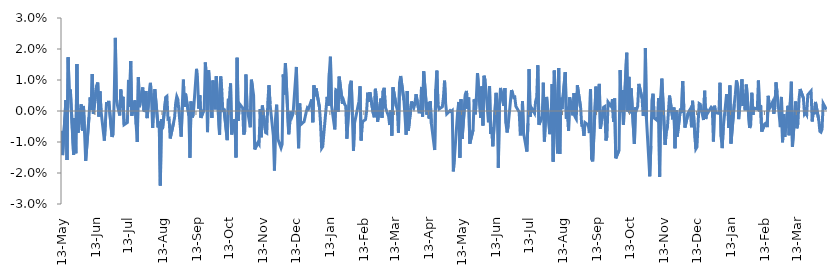
| Category | Series 0 |
|---|---|
| 2010-05-13 | -0.006 |
| 2010-05-14 | -0.014 |
| 2010-05-17 | 0.004 |
| 2010-05-18 | -0.016 |
| 2010-05-19 | 0.017 |
| 2010-05-20 | 0.006 |
| 2010-05-21 | 0.007 |
| 2010-05-24 | -0.014 |
| 2010-05-25 | -0.002 |
| 2010-05-26 | -0.014 |
| 2010-05-27 | 0.015 |
| 2010-05-28 | -0.007 |
| 2010-05-31 | 0.002 |
| 2010-06-01 | -0.006 |
| 2010-06-02 | 0.002 |
| 2010-06-03 | -0.007 |
| 2010-06-04 | -0.016 |
| 2010-06-07 | -0.002 |
| 2010-06-08 | 0.004 |
| 2010-06-09 | 0 |
| 2010-06-10 | 0.012 |
| 2010-06-11 | -0.001 |
| 2010-06-14 | 0.008 |
| 2010-06-15 | 0.009 |
| 2010-06-16 | -0.002 |
| 2010-06-17 | 0.006 |
| 2010-06-18 | 0 |
| 2010-06-21 | -0.01 |
| 2010-06-22 | -0.003 |
| 2010-06-23 | 0.003 |
| 2010-06-24 | 0.002 |
| 2010-06-25 | 0.003 |
| 2010-06-28 | -0.008 |
| 2010-06-29 | -0.007 |
| 2010-06-30 | 0.004 |
| 2010-07-01 | 0.024 |
| 2010-07-02 | 0.003 |
| 2010-07-05 | -0.001 |
| 2010-07-06 | 0.007 |
| 2010-07-07 | 0.001 |
| 2010-07-08 | 0.005 |
| 2010-07-09 | -0.004 |
| 2010-07-12 | -0.004 |
| 2010-07-13 | 0.01 |
| 2010-07-14 | 0.001 |
| 2010-07-15 | 0.016 |
| 2010-07-16 | -0.002 |
| 2010-07-19 | 0.003 |
| 2010-07-20 | -0.004 |
| 2010-07-21 | -0.01 |
| 2010-07-22 | 0.011 |
| 2010-07-23 | 0.001 |
| 2010-07-26 | 0.008 |
| 2010-07-27 | 0 |
| 2010-07-28 | 0 |
| 2010-07-29 | 0.006 |
| 2010-07-30 | -0.002 |
| 2010-08-02 | 0.009 |
| 2010-08-03 | 0.004 |
| 2010-08-04 | -0.005 |
| 2010-08-05 | 0.002 |
| 2010-08-06 | 0.007 |
| 2010-08-09 | -0.005 |
| 2010-08-10 | -0.003 |
| 2010-08-11 | -0.024 |
| 2010-08-12 | -0.003 |
| 2010-08-13 | -0.006 |
| 2010-08-16 | 0.004 |
| 2010-08-17 | 0.005 |
| 2010-08-18 | -0.003 |
| 2010-08-19 | -0.002 |
| 2010-08-20 | -0.009 |
| 2010-08-23 | -0.004 |
| 2010-08-24 | -0.002 |
| 2010-08-25 | 0.003 |
| 2010-08-26 | 0.005 |
| 2010-08-27 | 0.004 |
| 2010-08-30 | -0.008 |
| 2010-08-31 | 0.001 |
| 2010-09-01 | 0.01 |
| 2010-09-02 | 0.001 |
| 2010-09-03 | 0.006 |
| 2010-09-06 | -0.001 |
| 2010-09-07 | -0.015 |
| 2010-09-08 | 0.003 |
| 2010-09-09 | -0.002 |
| 2010-09-10 | -0.001 |
| 2010-09-13 | 0.014 |
| 2010-09-14 | 0.009 |
| 2010-09-15 | 0.001 |
| 2010-09-16 | 0.005 |
| 2010-09-17 | -0.002 |
| 2010-09-20 | 0.001 |
| 2010-09-21 | 0.016 |
| 2010-09-22 | 0.011 |
| 2010-09-23 | -0.007 |
| 2010-09-24 | 0.013 |
| 2010-09-27 | -0.002 |
| 2010-09-28 | 0.01 |
| 2010-09-29 | 0.003 |
| 2010-09-30 | 0.001 |
| 2010-10-01 | 0.011 |
| 2010-10-04 | -0.008 |
| 2010-10-05 | 0.011 |
| 2010-10-06 | 0.007 |
| 2010-10-07 | 0 |
| 2010-10-08 | 0.001 |
| 2010-10-11 | -0.009 |
| 2010-10-12 | 0.004 |
| 2010-10-13 | 0.002 |
| 2010-10-14 | 0.009 |
| 2010-10-15 | -0.008 |
| 2010-10-18 | -0.003 |
| 2010-10-19 | -0.015 |
| 2010-10-20 | 0.017 |
| 2010-10-21 | -0.003 |
| 2010-10-22 | 0.002 |
| 2010-10-25 | 0.001 |
| 2010-10-26 | -0.008 |
| 2010-10-27 | -0.006 |
| 2010-10-28 | 0.012 |
| 2010-10-29 | 0.001 |
| 2010-11-01 | -0.005 |
| 2010-11-02 | 0.01 |
| 2010-11-03 | 0.008 |
| 2010-11-04 | 0.005 |
| 2010-11-05 | -0.012 |
| 2010-11-08 | -0.01 |
| 2010-11-09 | -0.011 |
| 2010-11-10 | 0.001 |
| 2010-11-11 | -0.008 |
| 2010-11-12 | 0.002 |
| 2010-11-15 | -0.007 |
| 2010-11-16 | -0.007 |
| 2010-11-17 | 0.003 |
| 2010-11-18 | 0.008 |
| 2010-11-19 | 0.002 |
| 2010-11-22 | -0.008 |
| 2010-11-23 | -0.019 |
| 2010-11-24 | -0.002 |
| 2010-11-25 | 0.002 |
| 2010-11-26 | -0.009 |
| 2010-11-29 | -0.012 |
| 2010-11-30 | -0.011 |
| 2010-12-01 | 0.012 |
| 2010-12-02 | 0.005 |
| 2010-12-03 | 0.015 |
| 2010-12-06 | -0.007 |
| 2010-12-07 | -0.004 |
| 2010-12-08 | 0 |
| 2010-12-09 | -0.002 |
| 2010-12-10 | -0.001 |
| 2010-12-13 | 0.014 |
| 2010-12-14 | -0.002 |
| 2010-12-15 | -0.012 |
| 2010-12-16 | 0.002 |
| 2010-12-17 | -0.004 |
| 2010-12-20 | -0.003 |
| 2010-12-21 | -0.002 |
| 2010-12-22 | 0 |
| 2010-12-23 | 0.001 |
| 2010-12-24 | 0.001 |
| 2010-12-27 | 0.004 |
| 2010-12-28 | -0.004 |
| 2010-12-29 | 0.008 |
| 2010-12-30 | 0.005 |
| 2010-12-31 | 0.007 |
| 2011-01-03 | 0.001 |
| 2011-01-04 | -0.004 |
| 2011-01-05 | -0.012 |
| 2011-01-06 | -0.011 |
| 2011-01-07 | -0.007 |
| 2011-01-10 | 0.005 |
| 2011-01-11 | 0.002 |
| 2011-01-12 | 0.012 |
| 2011-01-13 | 0.018 |
| 2011-01-14 | 0.002 |
| 2011-01-17 | -0.006 |
| 2011-01-18 | 0.007 |
| 2011-01-19 | 0.007 |
| 2011-01-20 | 0 |
| 2011-01-21 | 0.011 |
| 2011-01-24 | 0.002 |
| 2011-01-25 | 0.003 |
| 2011-01-26 | 0.002 |
| 2011-01-27 | 0.002 |
| 2011-01-28 | -0.009 |
| 2011-01-31 | 0.009 |
| 2011-02-01 | 0.01 |
| 2011-02-02 | -0.001 |
| 2011-02-03 | -0.013 |
| 2011-02-04 | -0.004 |
| 2011-02-07 | 0.001 |
| 2011-02-08 | 0.003 |
| 2011-02-09 | 0.008 |
| 2011-02-10 | -0.01 |
| 2011-02-11 | -0.004 |
| 2011-02-14 | -0.003 |
| 2011-02-15 | 0 |
| 2011-02-16 | 0.006 |
| 2011-02-17 | 0.003 |
| 2011-02-18 | 0.006 |
| 2011-02-21 | -0.001 |
| 2011-02-22 | -0.002 |
| 2011-02-23 | 0.007 |
| 2011-02-24 | 0.004 |
| 2011-02-25 | -0.003 |
| 2011-02-28 | 0.004 |
| 2011-03-01 | -0.002 |
| 2011-03-02 | 0.006 |
| 2011-03-03 | 0.007 |
| 2011-03-04 | 0.001 |
| 2011-03-07 | -0.002 |
| 2011-03-08 | -0.005 |
| 2011-03-09 | 0 |
| 2011-03-10 | -0.008 |
| 2011-03-11 | 0.008 |
| 2011-03-14 | 0.002 |
| 2011-03-15 | 0 |
| 2011-03-16 | -0.007 |
| 2011-03-17 | 0.009 |
| 2011-03-18 | 0.011 |
| 2011-03-21 | 0.003 |
| 2011-03-22 | -0.002 |
| 2011-03-23 | -0.008 |
| 2011-03-24 | 0.006 |
| 2011-03-25 | -0.006 |
| 2011-03-28 | 0.003 |
| 2011-03-29 | 0.002 |
| 2011-03-30 | 0.001 |
| 2011-03-31 | 0.002 |
| 2011-04-01 | 0.005 |
| 2011-04-04 | -0.001 |
| 2011-04-05 | 0 |
| 2011-04-06 | 0.008 |
| 2011-04-07 | -0.002 |
| 2011-04-08 | 0.013 |
| 2011-04-11 | -0.001 |
| 2011-04-12 | 0.003 |
| 2011-04-13 | -0.002 |
| 2011-04-14 | 0.003 |
| 2011-04-15 | -0.004 |
| 2011-04-18 | -0.013 |
| 2011-04-19 | 0.007 |
| 2011-04-20 | 0.013 |
| 2011-04-21 | 0.002 |
| 2011-04-22 | 0.001 |
| 2011-04-25 | 0.001 |
| 2011-04-26 | 0.004 |
| 2011-04-27 | 0.01 |
| 2011-04-28 | 0.002 |
| 2011-04-29 | -0.001 |
| 2011-05-02 | 0 |
| 2011-05-03 | 0 |
| 2011-05-04 | 0 |
| 2011-05-05 | -0.019 |
| 2011-05-06 | -0.015 |
| 2011-05-09 | 0 |
| 2011-05-10 | 0.003 |
| 2011-05-11 | -0.015 |
| 2011-05-12 | 0.004 |
| 2011-05-13 | -0.009 |
| 2011-05-16 | 0.005 |
| 2011-05-17 | 0.006 |
| 2011-05-18 | 0.001 |
| 2011-05-19 | 0.004 |
| 2011-05-20 | -0.011 |
| 2011-05-23 | -0.006 |
| 2011-05-24 | 0.004 |
| 2011-05-25 | -0.001 |
| 2011-05-26 | 0.004 |
| 2011-05-27 | 0.012 |
| 2011-05-30 | -0.002 |
| 2011-05-31 | 0.008 |
| 2011-06-01 | -0.005 |
| 2011-06-02 | 0.011 |
| 2011-06-03 | 0.01 |
| 2011-06-06 | -0.004 |
| 2011-06-07 | 0.008 |
| 2011-06-08 | -0.007 |
| 2011-06-09 | -0.005 |
| 2011-06-10 | -0.011 |
| 2011-06-13 | 0.006 |
| 2011-06-14 | 0.002 |
| 2011-06-15 | -0.018 |
| 2011-06-16 | 0.002 |
| 2011-06-17 | 0.007 |
| 2011-06-20 | 0.002 |
| 2011-06-21 | 0.007 |
| 2011-06-22 | -0.004 |
| 2011-06-23 | -0.007 |
| 2011-06-24 | -0.005 |
| 2011-06-27 | 0.007 |
| 2011-06-28 | 0.006 |
| 2011-06-29 | 0.004 |
| 2011-06-30 | 0.004 |
| 2011-07-01 | 0.002 |
| 2011-07-04 | 0 |
| 2011-07-05 | -0.008 |
| 2011-07-06 | -0.008 |
| 2011-07-07 | 0.003 |
| 2011-07-08 | -0.007 |
| 2011-07-11 | -0.013 |
| 2011-07-12 | -0.004 |
| 2011-07-13 | 0.014 |
| 2011-07-14 | -0.002 |
| 2011-07-15 | 0.001 |
| 2011-07-18 | -0.001 |
| 2011-07-19 | 0.003 |
| 2011-07-20 | 0.004 |
| 2011-07-21 | 0.015 |
| 2011-07-22 | -0.004 |
| 2011-07-25 | -0.002 |
| 2011-07-26 | 0.009 |
| 2011-07-27 | -0.01 |
| 2011-07-28 | -0.002 |
| 2011-07-29 | 0.005 |
| 2011-08-01 | -0.007 |
| 2011-08-02 | -0.003 |
| 2011-08-03 | 0.009 |
| 2011-08-04 | -0.016 |
| 2011-08-05 | 0.013 |
| 2011-08-08 | -0.014 |
| 2011-08-09 | 0.014 |
| 2011-08-10 | -0.014 |
| 2011-08-11 | 0.004 |
| 2011-08-12 | 0.001 |
| 2011-08-15 | 0.013 |
| 2011-08-16 | -0.002 |
| 2011-08-17 | 0.001 |
| 2011-08-18 | -0.006 |
| 2011-08-19 | 0.004 |
| 2011-08-22 | -0.001 |
| 2011-08-23 | 0.006 |
| 2011-08-24 | -0.002 |
| 2011-08-25 | -0.003 |
| 2011-08-26 | 0.008 |
| 2011-08-29 | 0.001 |
| 2011-08-30 | -0.005 |
| 2011-08-31 | -0.005 |
| 2011-09-01 | -0.008 |
| 2011-09-02 | -0.004 |
| 2011-09-05 | -0.005 |
| 2011-09-06 | -0.007 |
| 2011-09-07 | 0.007 |
| 2011-09-08 | -0.016 |
| 2011-09-09 | -0.016 |
| 2011-09-12 | 0.008 |
| 2011-09-13 | 0 |
| 2011-09-14 | 0.006 |
| 2011-09-15 | 0.009 |
| 2011-09-16 | -0.006 |
| 2011-09-19 | 0.001 |
| 2011-09-20 | 0.001 |
| 2011-09-21 | -0.01 |
| 2011-09-22 | -0.008 |
| 2011-09-23 | 0.003 |
| 2011-09-26 | 0.001 |
| 2011-09-27 | 0.004 |
| 2011-09-28 | -0.003 |
| 2011-09-29 | 0.004 |
| 2011-09-30 | -0.015 |
| 2011-10-03 | -0.013 |
| 2011-10-04 | 0.013 |
| 2011-10-05 | 0 |
| 2011-10-06 | 0.007 |
| 2011-10-07 | -0.004 |
| 2011-10-10 | 0.019 |
| 2011-10-11 | 0 |
| 2011-10-12 | 0.011 |
| 2011-10-13 | -0.001 |
| 2011-10-14 | 0.007 |
| 2011-10-17 | -0.011 |
| 2011-10-18 | 0.001 |
| 2011-10-19 | 0 |
| 2011-10-20 | 0.002 |
| 2011-10-21 | 0.009 |
| 2011-10-24 | 0.004 |
| 2011-10-25 | -0.002 |
| 2011-10-26 | 0 |
| 2011-10-27 | 0.02 |
| 2011-10-28 | -0.003 |
| 2011-10-31 | -0.021 |
| 2011-11-01 | -0.011 |
| 2011-11-02 | 0.003 |
| 2011-11-03 | 0.006 |
| 2011-11-04 | -0.002 |
| 2011-11-07 | -0.003 |
| 2011-11-08 | 0.004 |
| 2011-11-09 | -0.021 |
| 2011-11-10 | 0.005 |
| 2011-11-11 | 0.01 |
| 2011-11-14 | -0.011 |
| 2011-11-15 | -0.007 |
| 2011-11-16 | -0.006 |
| 2011-11-17 | 0 |
| 2011-11-18 | 0.005 |
| 2011-11-21 | -0.003 |
| 2011-11-22 | 0.001 |
| 2011-11-23 | -0.012 |
| 2011-11-24 | 0 |
| 2011-11-25 | -0.008 |
| 2011-11-28 | 0.001 |
| 2011-11-29 | -0.001 |
| 2011-11-30 | 0.01 |
| 2011-12-01 | 0.001 |
| 2011-12-02 | -0.005 |
| 2011-12-05 | -0.001 |
| 2011-12-06 | 0 |
| 2011-12-07 | 0.001 |
| 2011-12-08 | -0.005 |
| 2011-12-09 | 0.003 |
| 2011-12-12 | -0.012 |
| 2011-12-13 | -0.012 |
| 2011-12-14 | -0.004 |
| 2011-12-15 | 0.002 |
| 2011-12-16 | 0.002 |
| 2011-12-19 | -0.003 |
| 2011-12-20 | 0.007 |
| 2011-12-21 | -0.003 |
| 2011-12-22 | 0 |
| 2011-12-23 | -0.001 |
| 2011-12-26 | 0.001 |
| 2011-12-27 | 0.001 |
| 2011-12-28 | -0.01 |
| 2011-12-29 | 0.002 |
| 2011-12-30 | -0.001 |
| 2012-01-02 | -0.001 |
| 2012-01-03 | 0.009 |
| 2012-01-04 | -0.008 |
| 2012-01-05 | -0.012 |
| 2012-01-06 | -0.005 |
| 2012-01-09 | 0.005 |
| 2012-01-10 | 0.001 |
| 2012-01-11 | -0.005 |
| 2012-01-12 | 0.008 |
| 2012-01-13 | -0.011 |
| 2012-01-16 | 0.002 |
| 2012-01-17 | 0.005 |
| 2012-01-18 | 0.01 |
| 2012-01-19 | 0.008 |
| 2012-01-20 | -0.003 |
| 2012-01-23 | 0.01 |
| 2012-01-24 | 0.002 |
| 2012-01-25 | 0.006 |
| 2012-01-26 | 0 |
| 2012-01-27 | 0.009 |
| 2012-01-30 | -0.005 |
| 2012-01-31 | -0.004 |
| 2012-02-01 | 0.006 |
| 2012-02-02 | -0.001 |
| 2012-02-03 | 0.001 |
| 2012-02-06 | 0.001 |
| 2012-02-07 | 0.01 |
| 2012-02-08 | 0 |
| 2012-02-09 | 0.002 |
| 2012-02-10 | -0.007 |
| 2012-02-13 | -0.004 |
| 2012-02-14 | -0.004 |
| 2012-02-15 | -0.005 |
| 2012-02-16 | 0.005 |
| 2012-02-17 | 0.001 |
| 2012-02-20 | 0.003 |
| 2012-02-21 | -0.001 |
| 2012-02-22 | 0.001 |
| 2012-02-23 | 0.009 |
| 2012-02-24 | 0.006 |
| 2012-02-27 | -0.005 |
| 2012-02-28 | 0.005 |
| 2012-02-29 | -0.01 |
| 2012-03-01 | -0.001 |
| 2012-03-02 | -0.008 |
| 2012-03-05 | 0.002 |
| 2012-03-06 | -0.008 |
| 2012-03-07 | 0.003 |
| 2012-03-08 | 0.009 |
| 2012-03-09 | -0.012 |
| 2012-03-12 | 0.003 |
| 2012-03-13 | -0.006 |
| 2012-03-14 | -0.004 |
| 2012-03-15 | 0.004 |
| 2012-03-16 | 0.007 |
| 2012-03-19 | 0.004 |
| 2012-03-20 | -0.001 |
| 2012-03-21 | -0.001 |
| 2012-03-22 | -0.001 |
| 2012-03-23 | 0.005 |
| 2012-03-26 | 0.006 |
| 2012-03-27 | -0.003 |
| 2012-03-28 | 0 |
| 2012-03-29 | -0.001 |
| 2012-03-30 | 0.003 |
| 2012-04-02 | -0.003 |
| 2012-04-03 | -0.007 |
| 2012-04-04 | -0.007 |
| 2012-04-05 | -0.006 |
| 2012-04-06 | 0.002 |
| 2012-04-09 | 0 |